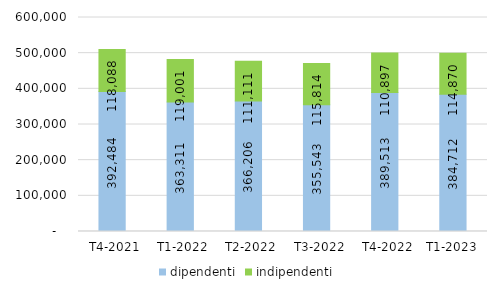
| Category | dipendenti | indipendenti |
|---|---|---|
|   T4-2021 | 392484 | 118088 |
|   T1-2022 | 363311 | 119001 |
|   T2-2022 | 366206 | 111111 |
|   T3-2022 | 355543 | 115814 |
|   T4-2022 | 389513 | 110897 |
| T1-2023 | 384712 | 114870 |